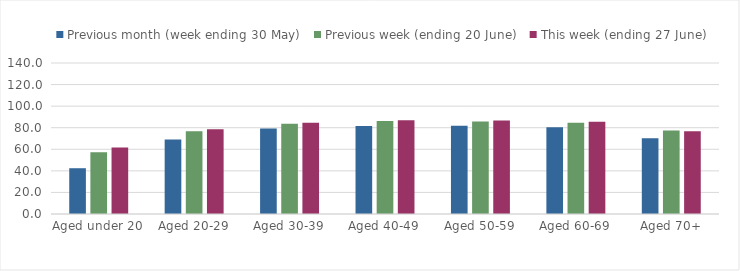
| Category | Previous month (week ending 30 May) | Previous week (ending 20 June) | This week (ending 27 June) |
|---|---|---|---|
| Aged under 20 | 42.436 | 57.288 | 61.6 |
| Aged 20-29 | 69.127 | 76.77 | 78.484 |
| Aged 30-39 | 79.268 | 83.636 | 84.708 |
| Aged 40-49 | 81.698 | 86.199 | 86.975 |
| Aged 50-59 | 81.832 | 85.732 | 86.652 |
| Aged 60-69 | 80.349 | 84.643 | 85.6 |
| Aged 70+ | 70.182 | 77.387 | 76.81 |